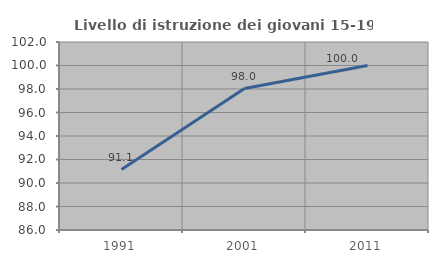
| Category | Livello di istruzione dei giovani 15-19 anni |
|---|---|
| 1991.0 | 91.139 |
| 2001.0 | 98.039 |
| 2011.0 | 100 |